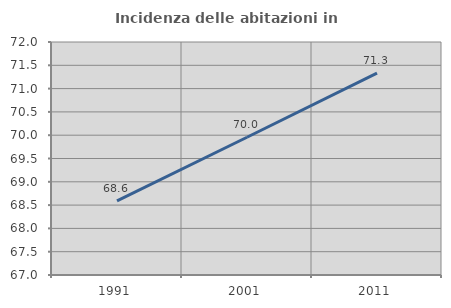
| Category | Incidenza delle abitazioni in proprietà  |
|---|---|
| 1991.0 | 68.589 |
| 2001.0 | 69.956 |
| 2011.0 | 71.331 |